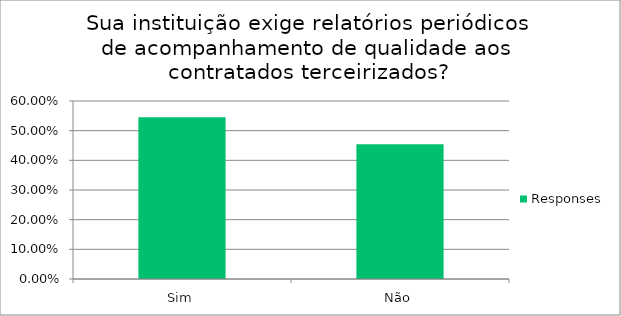
| Category | Responses |
|---|---|
| Sim | 0.546 |
| Não | 0.454 |